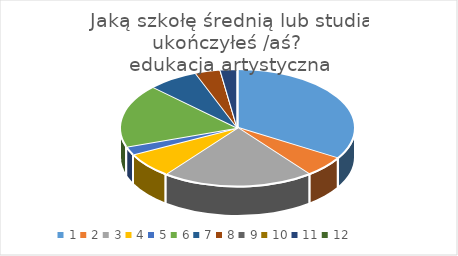
| Category | Series 0 |
|---|---|
| 0 | 29 |
| 1 | 5 |
| 2 | 18 |
| 3 | 6 |
| 4 | 2 |
| 5 | 15 |
| 6 | 6 |
| 7 | 3 |
| 8 | 0 |
| 9 | 0 |
| 10 | 2 |
| 11 | 0 |